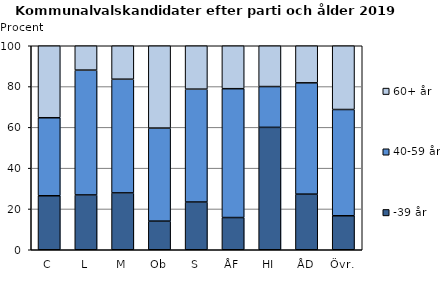
| Category | -39 år | 40-59 år | 60+ år |
|---|---|---|---|
| C | 26.471 | 38.235 | 35.294 |
| L | 26.866 | 61.194 | 11.94 |
| M | 27.869 | 55.738 | 16.393 |
| Ob | 14.035 | 45.614 | 40.351 |
| S | 23.404 | 55.319 | 21.277 |
| ÅF | 15.789 | 63.158 | 21.053 |
| HI | 60 | 20 | 20 |
| ÅD | 27.273 | 54.545 | 18.182 |
| Övr. | 16.667 | 52.083 | 31.25 |